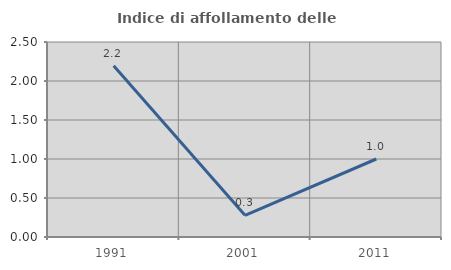
| Category | Indice di affollamento delle abitazioni  |
|---|---|
| 1991.0 | 2.194 |
| 2001.0 | 0.279 |
| 2011.0 | 1 |